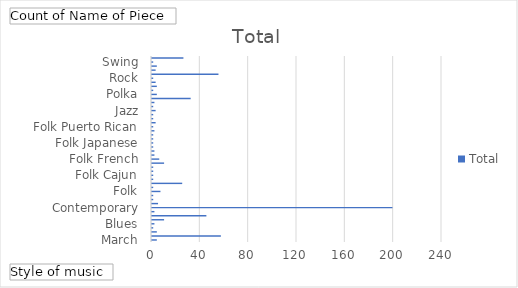
| Category | Total |
|---|---|
| March | 4 |
| Baroque | 57 |
| Baroque  | 4 |
| Black Spiritual | 1 |
| Blues | 2 |
| Christmas Carol | 10 |
| Classical | 45 |
| Classical  | 2 |
| Contemporary | 199 |
| Early 20th Century | 5 |
| Eastern | 1 |
| Etude | 1 |
| Folk | 7 |
| Folk African | 1 |
| Folk American | 25 |
| Folk American Dance | 1 |
| Folk Cajun | 1 |
| Folk Contemporary | 1 |
| Folk Ecuadorian | 1 |
| Folk English | 10 |
| Folk French | 6 |
| Folk German | 2 |
| Folk Israeli | 2 |
| Folk Italian | 1 |
| Folk Japanese | 1 |
| Folk Jewish | 1 |
| Folk Korean | 1 |
| Folk Minstrel | 2 |
| Folk Puerto Rican | 1 |
| Folk Russian | 3 |
| Folk Scottish | 1 |
| Gospel | 1 |
| Jazz | 3 |
| Jazz Ballad | 1 |
| Late-Romantic | 2 |
| Neo-Classical | 32 |
| Polka | 4 |
| Pop 19th | 1 |
| Ragtime | 4 |
| Renaissance | 3 |
| Rock | 1 |
| Romantic | 55 |
| Romatic | 3 |
| Spiritual | 4 |
| Swing | 1 |
| Unkwn | 26 |